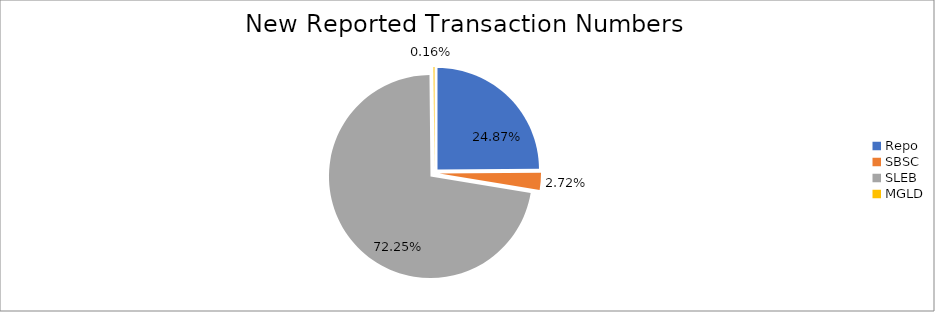
| Category | Series 0 |
|---|---|
| Repo | 251878 |
| SBSC | 27518 |
| SLEB | 731583 |
| MGLD | 1626 |